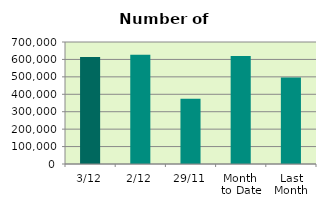
| Category | Series 0 |
|---|---|
| 3/12 | 613338 |
| 2/12 | 627032 |
| 29/11 | 373856 |
| Month 
to Date | 620185 |
| Last
Month | 495852.095 |